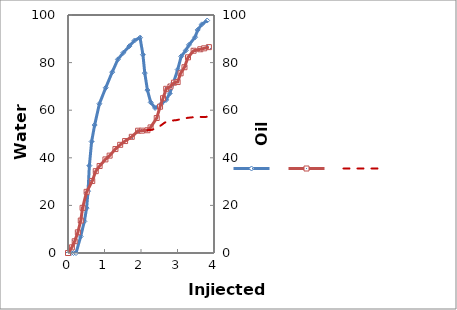
| Category | Series 0 |
|---|---|
| 0.0 | 0 |
| 0.0831325 | 0 |
| 0.151807 | 0 |
| 0.220482 | 0 |
| 0.346988 | 6.944 |
| 0.448193 | 13.294 |
| 0.509639 | 18.849 |
| 0.549398 | 25.992 |
| 0.585542 | 36.706 |
| 0.646988 | 46.825 |
| 0.73012 | 53.77 |
| 0.860241 | 62.698 |
| 1.03373 | 69.444 |
| 1.21084 | 75.992 |
| 1.36627 | 81.349 |
| 1.51446 | 84.127 |
| 1.68072 | 86.905 |
| 1.82169 | 89.286 |
| 1.97349 | 90.476 |
| 2.05301 | 83.333 |
| 2.10361 | 75.595 |
| 2.1759 | 68.452 |
| 2.26627 | 63.294 |
| 2.38579 | 60.932 |
| 2.54822 | 62.545 |
| 2.69036 | 64.337 |
| 2.7868 | 67.025 |
| 2.88832 | 71.505 |
| 3.00508 | 77.061 |
| 3.10152 | 82.616 |
| 3.22843 | 85.125 |
| 3.31472 | 87.455 |
| 3.48223 | 90.681 |
| 3.5533 | 93.728 |
| 3.66497 | 96.057 |
| 3.81218 | 97.67 |